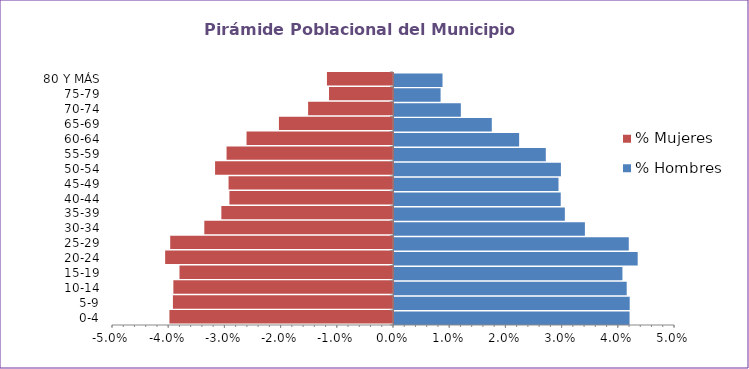
| Category | % Hombres | % Mujeres |
|---|---|---|
| 0-4 | 0.042 | -0.04 |
| 5-9 | 0.042 | -0.039 |
| 10-14 | 0.041 | -0.039 |
| 15-19 | 0.041 | -0.038 |
| 20-24 | 0.043 | -0.041 |
| 25-29 | 0.042 | -0.04 |
| 30-34 | 0.034 | -0.034 |
| 35-39 | 0.03 | -0.031 |
| 40-44 | 0.03 | -0.029 |
| 45-49 | 0.029 | -0.029 |
| 50-54 | 0.03 | -0.032 |
| 55-59 | 0.027 | -0.03 |
| 60-64 | 0.022 | -0.026 |
| 65-69 | 0.017 | -0.02 |
| 70-74 | 0.012 | -0.015 |
| 75-79 | 0.008 | -0.011 |
| 80 Y MÁS | 0.009 | -0.012 |